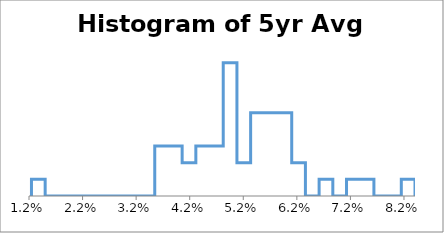
| Category | Series 0 |
|---|---|
| 0.012460631412298508 | 0 |
| 0.012460631412298508 | 1 |
| 0.015017635179668913 | 1 |
| 0.015017635179668913 | 0 |
| 0.01757463894703932 | 0 |
| 0.01757463894703932 | 0 |
| 0.020131642714409727 | 0 |
| 0.020131642714409727 | 0 |
| 0.022688646481780133 | 0 |
| 0.022688646481780133 | 0 |
| 0.02524565024915054 | 0 |
| 0.02524565024915054 | 0 |
| 0.027802654016520947 | 0 |
| 0.027802654016520947 | 0 |
| 0.030359657783891353 | 0 |
| 0.030359657783891353 | 0 |
| 0.03291666155126176 | 0 |
| 0.03291666155126176 | 0 |
| 0.035473665318632164 | 0 |
| 0.035473665318632164 | 3 |
| 0.03803066908600257 | 3 |
| 0.03803066908600257 | 3 |
| 0.040587672853372975 | 3 |
| 0.040587672853372975 | 2 |
| 0.04314467662074338 | 2 |
| 0.04314467662074338 | 3 |
| 0.04570168038811379 | 3 |
| 0.04570168038811379 | 3 |
| 0.0482586841554842 | 3 |
| 0.0482586841554842 | 8 |
| 0.050815687922854604 | 8 |
| 0.050815687922854604 | 2 |
| 0.05337269169022501 | 2 |
| 0.05337269169022501 | 5 |
| 0.055929695457595414 | 5 |
| 0.055929695457595414 | 5 |
| 0.05848669922496582 | 5 |
| 0.05848669922496582 | 5 |
| 0.061043702992336225 | 5 |
| 0.061043702992336225 | 2 |
| 0.06360070675970664 | 2 |
| 0.06360070675970664 | 0 |
| 0.06615771052707704 | 0 |
| 0.06615771052707704 | 1 |
| 0.06871471429444745 | 1 |
| 0.06871471429444745 | 0 |
| 0.07127171806181785 | 0 |
| 0.07127171806181785 | 1 |
| 0.07382872182918826 | 1 |
| 0.07382872182918826 | 1 |
| 0.07638572559655868 | 1 |
| 0.07638572559655868 | 0 |
| 0.07894272936392907 | 0 |
| 0.07894272936392907 | 0 |
| 0.08149973313129949 | 0 |
| 0.08149973313129949 | 1 |
| 0.08405673689866988 | 1 |
| 0.08405673689866988 | 0 |